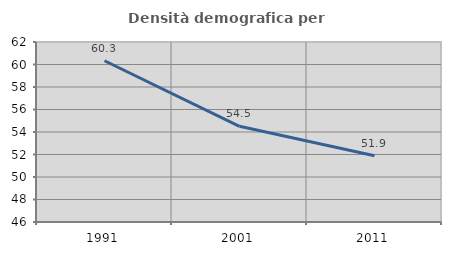
| Category | Densità demografica |
|---|---|
| 1991.0 | 60.332 |
| 2001.0 | 54.504 |
| 2011.0 | 51.889 |